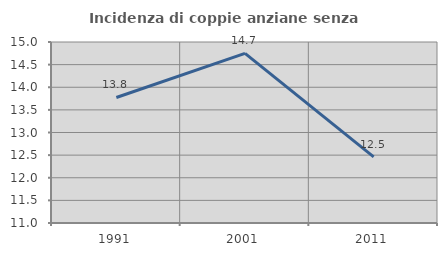
| Category | Incidenza di coppie anziane senza figli  |
|---|---|
| 1991.0 | 13.774 |
| 2001.0 | 14.749 |
| 2011.0 | 12.461 |